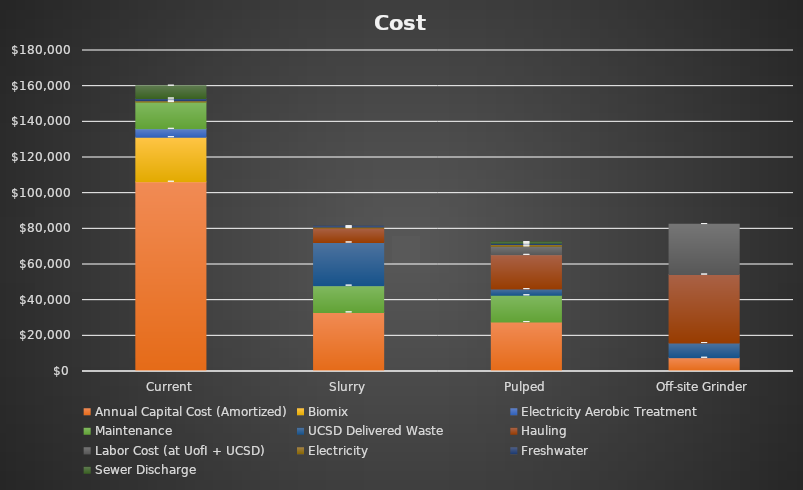
| Category | Capital Cost (Equipment, Collection bins and construction) | Annual Capital Cost (Amortized) | Operating Cost | Biomix | Electricity Aerobic Treatment | Maintenance | UCSD Delivered Waste | Hauling | Labor Cost (at UofI + UCSD) | Electricity | Freshwater | Sewer Discharge |
|---|---|---|---|---|---|---|---|---|---|---|---|---|
| Current |  | 106400 |  | 25000 | 4665 | 15000 | 0 | 0 | 0 | 800 | 1200 | 7200 |
| Slurry |  | 33150 |  | 0 | 0 | 15000 | 24200 | 8050 | 0 | 600 | 480 | 0 |
| Pulped |  | 27725 |  | 0 | 0 | 15000 | 3475 | 19200 | 4800 | 1050 | 725 | 580 |
| Off-site Grinder |  | 7700 |  | 0 | 0 | 0 | 8265 | 38400 | 28320 | 0 | 0 | 0 |